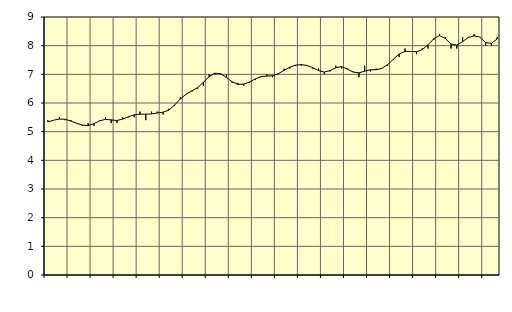
| Category | Piggar | Byggverksamhet, SNI 41-43 |
|---|---|---|
| nan | 5.4 | 5.34 |
| 1.0 | 5.4 | 5.4 |
| 1.0 | 5.5 | 5.44 |
| 1.0 | 5.4 | 5.43 |
| nan | 5.4 | 5.37 |
| 2.0 | 5.3 | 5.29 |
| 2.0 | 5.2 | 5.23 |
| 2.0 | 5.3 | 5.21 |
| nan | 5.2 | 5.28 |
| 3.0 | 5.4 | 5.38 |
| 3.0 | 5.5 | 5.43 |
| 3.0 | 5.3 | 5.41 |
| nan | 5.3 | 5.39 |
| 4.0 | 5.5 | 5.44 |
| 4.0 | 5.5 | 5.52 |
| 4.0 | 5.5 | 5.59 |
| nan | 5.7 | 5.61 |
| 5.0 | 5.4 | 5.61 |
| 5.0 | 5.7 | 5.62 |
| 5.0 | 5.7 | 5.65 |
| nan | 5.6 | 5.68 |
| 6.0 | 5.8 | 5.75 |
| 6.0 | 5.9 | 5.93 |
| 6.0 | 6.2 | 6.14 |
| nan | 6.3 | 6.31 |
| 7.0 | 6.4 | 6.42 |
| 7.0 | 6.5 | 6.54 |
| 7.0 | 6.6 | 6.72 |
| nan | 7 | 6.92 |
| 8.0 | 7 | 7.04 |
| 8.0 | 7 | 7.02 |
| 8.0 | 7 | 6.89 |
| nan | 6.7 | 6.74 |
| 9.0 | 6.7 | 6.65 |
| 9.0 | 6.6 | 6.66 |
| 9.0 | 6.7 | 6.73 |
| nan | 6.8 | 6.84 |
| 10.0 | 6.9 | 6.92 |
| 10.0 | 7 | 6.94 |
| 10.0 | 6.9 | 6.95 |
| nan | 7 | 7.02 |
| 11.0 | 7.2 | 7.14 |
| 11.0 | 7.2 | 7.25 |
| 11.0 | 7.3 | 7.32 |
| nan | 7.3 | 7.34 |
| 12.0 | 7.3 | 7.31 |
| 12.0 | 7.2 | 7.23 |
| 12.0 | 7.2 | 7.13 |
| nan | 7 | 7.08 |
| 13.0 | 7.1 | 7.13 |
| 13.0 | 7.3 | 7.23 |
| 13.0 | 7.2 | 7.27 |
| nan | 7.2 | 7.18 |
| 14.0 | 7.1 | 7.08 |
| 14.0 | 6.9 | 7.05 |
| 14.0 | 7.3 | 7.11 |
| nan | 7.1 | 7.16 |
| 15.0 | 7.2 | 7.16 |
| 15.0 | 7.2 | 7.21 |
| 15.0 | 7.3 | 7.34 |
| nan | 7.5 | 7.53 |
| 16.0 | 7.6 | 7.71 |
| 16.0 | 7.9 | 7.8 |
| 16.0 | 7.8 | 7.8 |
| nan | 7.7 | 7.79 |
| 17.0 | 7.9 | 7.86 |
| 17.0 | 7.9 | 8.03 |
| 17.0 | 8.2 | 8.24 |
| nan | 8.4 | 8.35 |
| 18.0 | 8.3 | 8.25 |
| 18.0 | 7.9 | 8.06 |
| 18.0 | 7.9 | 8.02 |
| nan | 8.3 | 8.14 |
| 19.0 | 8.3 | 8.29 |
| 19.0 | 8.4 | 8.34 |
| 19.0 | 8.3 | 8.3 |
| nan | 8 | 8.11 |
| 20.0 | 8 | 8.08 |
| 20.0 | 8.3 | 8.23 |